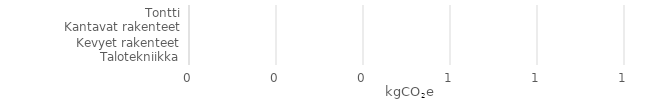
| Category | Hiilijalanjälki | Hiilikädenjälki |
|---|---|---|
| Talotekniikka | 0 | 0 |
| Kevyet rakenteet | 0 | 0 |
| Kantavat rakenteet | 0 | 0 |
| Tontti | 0 | 0 |